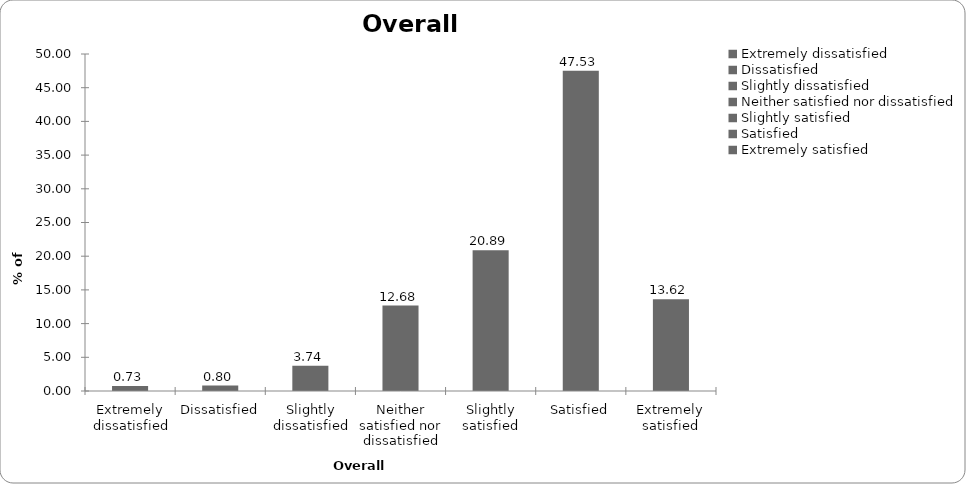
| Category | Overall satisfaction |
|---|---|
| Extremely dissatisfied | 0.734 |
| Dissatisfied | 0.801 |
| Slightly dissatisfied | 3.738 |
| Neither satisfied nor dissatisfied | 12.684 |
| Slightly satisfied | 20.895 |
| Satisfied | 47.53 |
| Extremely satisfied | 13.618 |